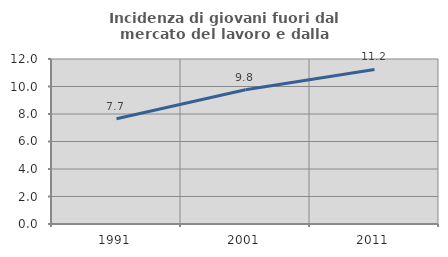
| Category | Incidenza di giovani fuori dal mercato del lavoro e dalla formazione  |
|---|---|
| 1991.0 | 7.651 |
| 2001.0 | 9.763 |
| 2011.0 | 11.24 |